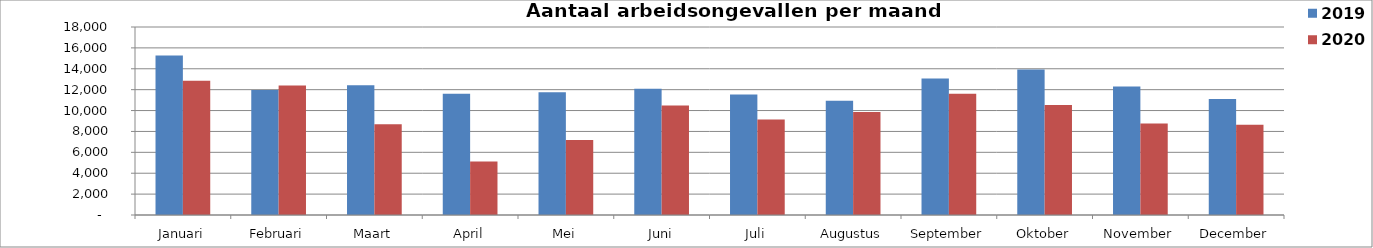
| Category | 2019 | 2020 |
|---|---|---|
| Januari | 15269 | 12863 |
| Februari | 11960 | 12403 |
| Maart | 12420 | 8677 |
| April | 11615 | 5124 |
| Mei | 11763 | 7185 |
| Juni | 12089 | 10491 |
| Juli | 11533 | 9141 |
| Augustus | 10929 | 9853 |
| September | 13074 | 11621 |
| Oktober | 13942 | 10529 |
| November | 12310 | 8761 |
| December | 11099 | 8651 |